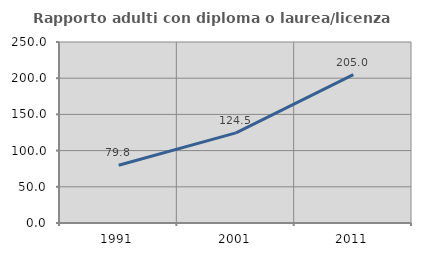
| Category | Rapporto adulti con diploma o laurea/licenza media  |
|---|---|
| 1991.0 | 79.791 |
| 2001.0 | 124.506 |
| 2011.0 | 204.983 |